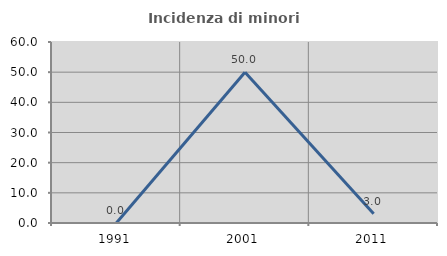
| Category | Incidenza di minori stranieri |
|---|---|
| 1991.0 | 0 |
| 2001.0 | 50 |
| 2011.0 | 3.03 |